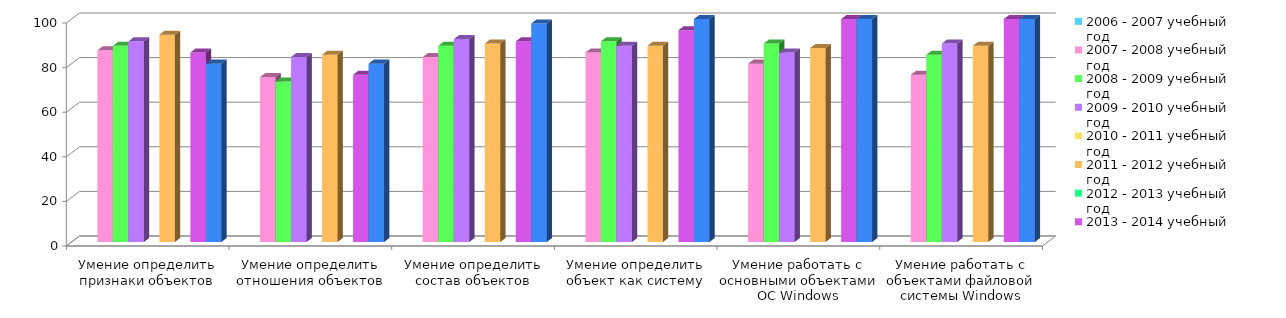
| Category | 2006 - 2007 учебный год | 2007 - 2008 учебный год | 2008 - 2009 учебный год | 2009 - 2010 учебный год | 2010 - 2011 учебный год | 2011 - 2012 учебный год | 2012 - 2013 учебный год | 2013 - 2014 учебный год | 2014 - 2015 учебный год |
|---|---|---|---|---|---|---|---|---|---|
| Умение определить признаки объектов |  | 86 | 88 | 90 |  | 93 |  | 85 | 80 |
| Умение определить отношения объектов |  | 74 | 72 | 83 |  | 84 |  | 75 | 80 |
| Умение определить состав объектов |  | 83 | 88 | 91 |  | 89 |  | 90 | 98 |
| Умение определить объект как систему |  | 85 | 90 | 88 |  | 88 |  | 95 | 100 |
| Умение работать с основными объектами ОС Windows |  | 80 | 89 | 85 |  | 87 |  | 100 | 100 |
| Умение работать с объектами файловой системы Windows |  | 75 | 84 | 89 |  | 88 |  | 100 | 100 |